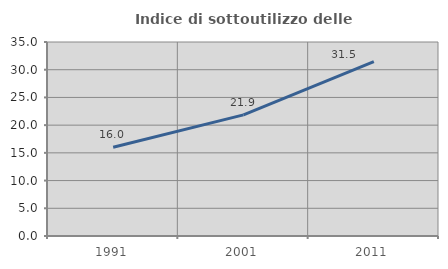
| Category | Indice di sottoutilizzo delle abitazioni  |
|---|---|
| 1991.0 | 16.024 |
| 2001.0 | 21.857 |
| 2011.0 | 31.478 |